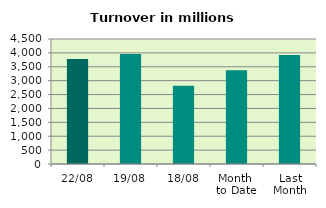
| Category | Series 0 |
|---|---|
| 22/08 | 3782.341 |
| 19/08 | 3956.466 |
| 18/08 | 2818.988 |
| Month 
to Date | 3373.653 |
| Last
Month | 3920.999 |